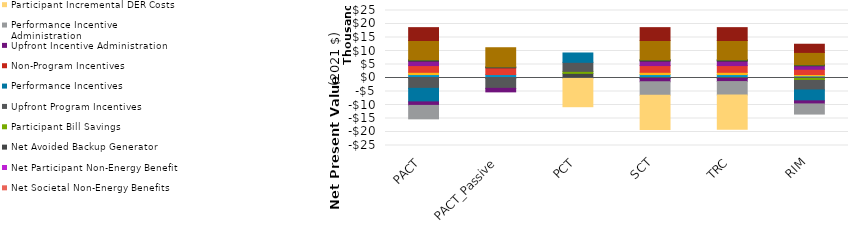
| Category | Avoided Energy  | Avoided Generation Capacity - Passive | Avoided Generation Capacity - Active | Avoided T&D Capacity - Passive | Avoided T&D Capacity - Active | Reliability - Passive | Reliability - Active | DRIPE Energy Impacts  | DRIPE Capacity Impacts - Passive | DRIPE Capacity Impacts - Active | Cross-DRIPE Impacts | Non-Embedded Emissions | Market Revenue | Avoided Ancillary Services | Job Creation Benefits | Net Societal Non-Energy Benefits | Net Participant Non-Energy Benefits | Net Avoided Backup Generator | Participant Bill Savings  | Upfront Program Incentives  | Performance Incentives | Non-Program Incentives | Upfront Incentive Administration | Performance Incentive Administration | Participant Incremental DER Costs  |
|---|---|---|---|---|---|---|---|---|---|---|---|---|---|---|---|---|---|---|---|---|---|---|---|---|---|
| PACT | -7.07 | 1264.394 | 842.93 | 2495.799 | 1663.866 | 263.688 | 175.792 | 46.239 | 7138.647 | 4759.098 | -4.858 | 0 | 0 | 0 | 0 | 0 | 0 | 0 | 0 | -3817.513 | -5014.748 | 0 | -1307.359 | -4974.259 | 0 |
| PACT_Passive | -7.07 | 1264.394 | 0 | 2495.799 | 0 | 263.688 | 0 | 46.239 | 7138.647 | 0 | -4.858 | 0 | 0 | 0 | 0 | 0 | 0 | 0 | 0 | -3817.513 | 0 | 0 | -1307.359 | 0 | 0 |
| PCT | 0 | 0 | 0 | 0 | 0 | 0 | 0 | 0 | 0 | 0 | 0 | 0 | 0 | 0 | 0 | 0 | 0 | 1719.669 | 740.1 | 3347.107 | 3458.113 | 0 | 0 | 0 | -10633.939 |
| SCT | -7.07 | 1264.394 | 842.93 | 2495.799 | 1663.866 | 263.688 | 175.792 | 46.239 | 7138.647 | 4759.098 | -4.858 | -70.153 | 0 | 0 | 0 | 0 | 0 | 0 | 0 | 0 | 0 | 0 | -1307.359 | -4974.259 | -12666.289 |
| TRC | -7.07 | 1264.394 | 842.93 | 2495.799 | 1663.866 | 263.688 | 175.792 | 46.239 | 7138.647 | 4759.098 | -4.858 | 0 | 0 | 0 | 0 | 0 | 0 | 0 | 0 | 0 | 0 | 0 | -1307.359 | -4974.259 | -12666.289 |
| RIM | -5.634 | 771.925 | 514.617 | 1946.888 | 1297.925 | 216.22 | 144.147 | 36.012 | 4547.01 | 3031.34 | -3.992 | 0 | 0 | 0 | 0 | 0 | 0 | 0 | -877.49 | -3537.427 | -4028.784 | 0 | -1143.677 | -3759.861 | 0 |